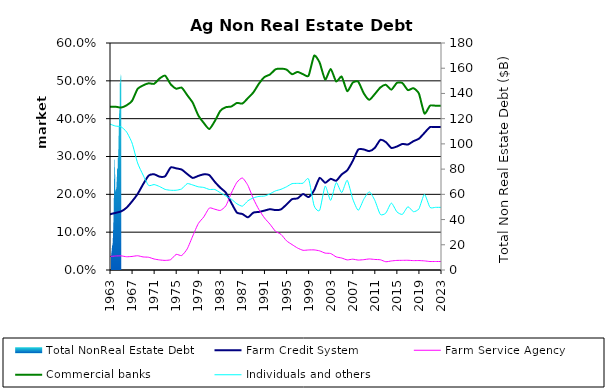
| Category | Total NonReal Estate Debt |
|---|---|
| 1960.0 | 11136073 |
| 1961.0 | 11819926 |
| 1962.0 | 13176959 |
| 1963.0 | 14579582 |
| 1964.0 | 15306930 |
| 1965.0 | 16894897 |
| 1966.0 | 18527052 |
| 1967.0 | 19592588 |
| 1968.0 | 19192320 |
| 1969.0 | 20004960 |
| 1970.0 | 21262659 |
| 1971.0 | 23998571 |
| 1972.0 | 26720062 |
| 1973.0 | 31580354 |
| 1974.0 | 35109684 |
| 1975.0 | 39752777 |
| 1976.0 | 45652689 |
| 1977.0 | 52569982 |
| 1978.0 | 60440998 |
| 1979.0 | 71742137 |
| 1980.0 | 77159601 |
| 1981.0 | 83782208 |
| 1982.0 | 87193913 |
| 1983.0 | 88106779 |
| 1984.0 | 87420023 |
| 1985.0 | 78064559 |
| 1986.0 | 67220161 |
| 1987.0 | 62697543 |
| 1988.0 | 62308927 |
| 1989.0 | 62268982 |
| 1990.0 | 63482823 |
| 1991.0 | 64422903 |
| 1992.0 | 63686475 |
| 1993.0 | 65878849 |
| 1994.0 | 69017203 |
| 1995.0 | 71262319 |
| 1996.0 | 74150521 |
| 1997.0 | 78393822 |
| 1998.0 | 81526050 |
| 1999.0 | 80490057 |
| 2000.0 | 79206060 |
| 2001.0 | 82123435 |
| 2002.0 | 88910829 |
| 2003.0 | 83699555 |
| 2004.0 | 93415679 |
| 2005.0 | 95187185 |
| 2006.0 | 102319434 |
| 2007.0 | 109025002 |
| 2008.0 | 113161260 |
| 2009.0 | 122366725 |
| 2010.0 | 124865309 |
| 2011.0 | 127281365 |
| 2012.0 | 124152487 |
| 2013.0 | 130171958 |
| 2014.0 | 148421130 |
| 2015.0 | 147968795 |
| 2016.0 | 148183780 |
| 2017.0 | 154182166 |
| 2018.0 | 156831966 |
| 2019.0 | 152551145 |
| 2020.0 | 152608468 |
| 2021.0 | 149858504 |
| 2022.0 | 154826805 |
| 2023.0 | 159225667 |